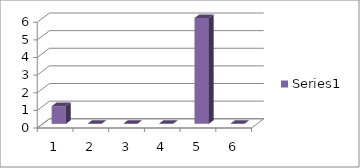
| Category | Series 0 |
|---|---|
| 0 | 1 |
| 1 | 0 |
| 2 | 0 |
| 3 | 0 |
| 4 | 6 |
| 5 | 0 |